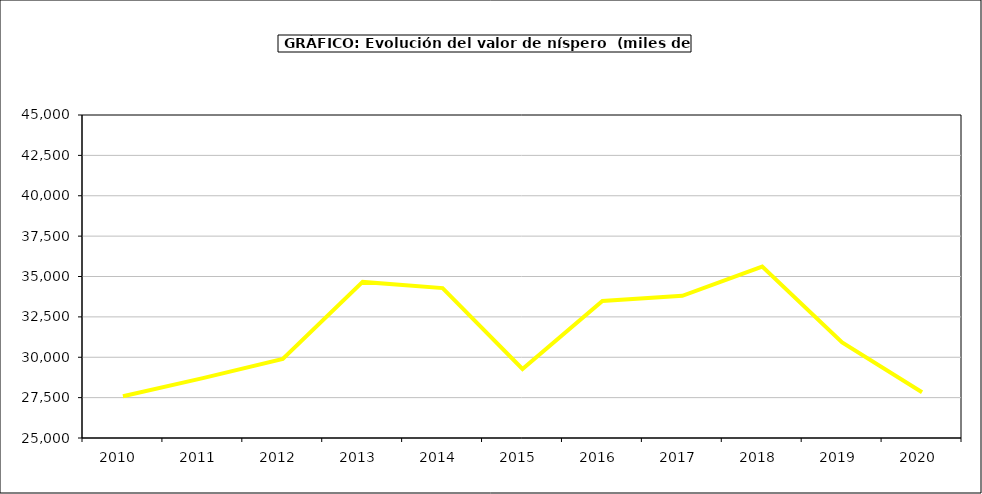
| Category | valor níspero |
|---|---|
| 2010.0 | 27580.978 |
| 2011.0 | 28708.277 |
| 2012.0 | 29897.05 |
| 2013.0 | 34664.445 |
| 2014.0 | 34281.045 |
| 2015.0 | 29278 |
| 2016.0 | 33490 |
| 2017.0 | 33807.127 |
| 2018.0 | 35617.316 |
| 2019.0 | 30923.726 |
| 2020.0 | 27836.442 |